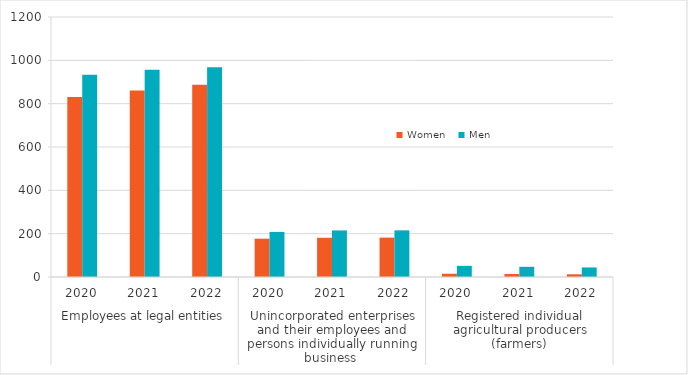
| Category | Women | Men |
|---|---|---|
| 0 | 830.669 | 933.458 |
| 1 | 861 | 956 |
| 2 | 887.883 | 968.533 |
| 3 | 176.893 | 208.079 |
| 4 | 181 | 215 |
| 5 | 181.745 | 215.313 |
| 6 | 15 | 51.422 |
| 7 | 14 | 47 |
| 8 | 12.506 | 44.055 |